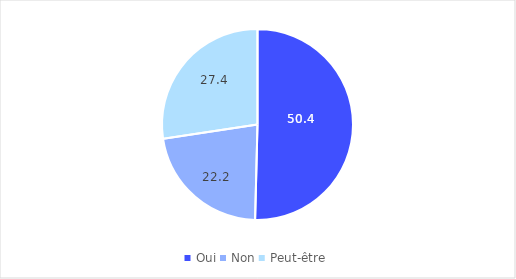
| Category | Series 0 |
|---|---|
| Oui | 50.4 |
| Non | 22.2 |
| Peut-être | 27.4 |